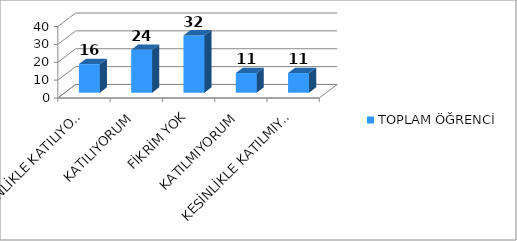
| Category | TOPLAM ÖĞRENCİ |
|---|---|
| KESİNLİKLE KATILIYORUM | 16 |
| KATILIYORUM | 24 |
| FİKRİM YOK | 32 |
| KATILMIYORUM | 11 |
| KESİNLİKLE KATILMIYORUM | 11 |